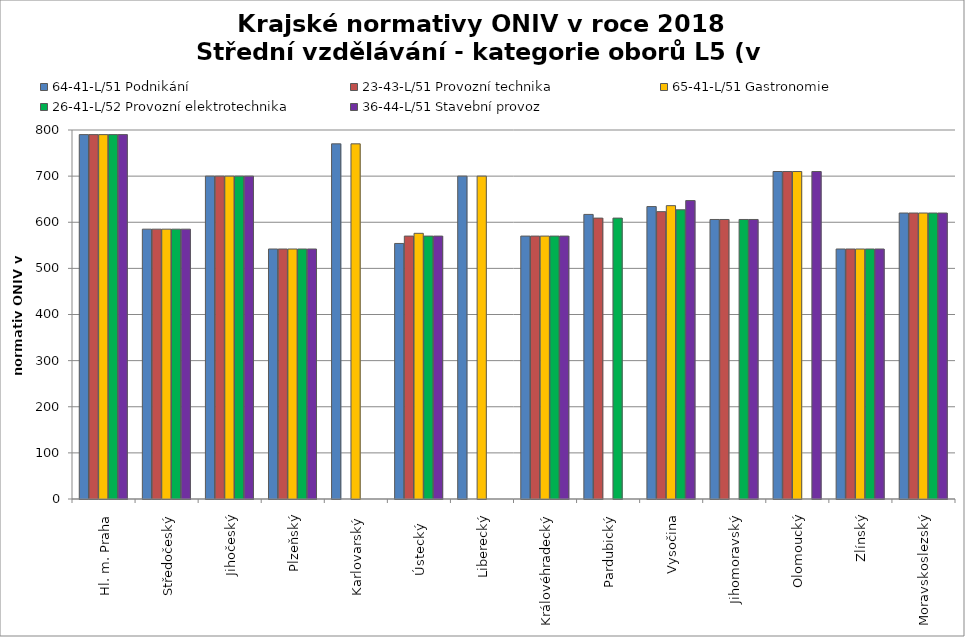
| Category | 64-41-L/51 Podnikání | 23-43-L/51 Provozní technika | 65-41-L/51 Gastronomie | 26-41-L/52 Provozní elektrotechnika | 36-44-L/51 Stavební provoz |
|---|---|---|---|---|---|
| Hl. m. Praha | 790 | 790 | 790 | 790 | 790 |
| Středočeský | 585 | 585 | 585 | 585 | 585 |
| Jihočeský | 700 | 700 | 700 | 700 | 700 |
| Plzeňský | 542 | 542 | 542 | 542 | 542 |
| Karlovarský  | 770 | 0 | 770 | 0 | 0 |
| Ústecký   | 554 | 570 | 576 | 570 | 570 |
| Liberecký | 700 | 0 | 700 | 0 | 0 |
| Královéhradecký | 570 | 570 | 570 | 570 | 570 |
| Pardubický | 617 | 609 | 0 | 609 | 0 |
| Vysočina | 634 | 623 | 636 | 627 | 647 |
| Jihomoravský | 606 | 606 | 0 | 606 | 606 |
| Olomoucký | 710 | 710 | 710 | 0 | 710 |
| Zlínský | 542 | 542 | 542 | 542 | 542 |
| Moravskoslezský | 620 | 620 | 620 | 620 | 620 |